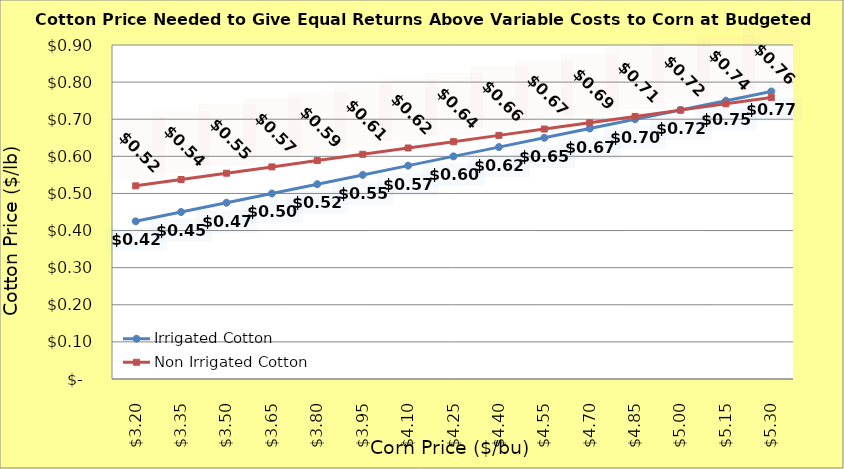
| Category | Irrigated Cotton | Non Irrigated Cotton |
|---|---|---|
| 3.2 | 0.425 | 0.521 |
| 3.35 | 0.45 | 0.538 |
| 3.5 | 0.475 | 0.555 |
| 3.65 | 0.5 | 0.572 |
| 3.8 | 0.525 | 0.589 |
| 3.9499999999999997 | 0.55 | 0.606 |
| 4.1 | 0.575 | 0.623 |
| 4.25 | 0.6 | 0.64 |
| 4.4 | 0.625 | 0.657 |
| 4.550000000000001 | 0.65 | 0.674 |
| 4.700000000000001 | 0.675 | 0.691 |
| 4.850000000000001 | 0.7 | 0.708 |
| 5.000000000000002 | 0.725 | 0.725 |
| 5.150000000000002 | 0.75 | 0.742 |
| 5.3000000000000025 | 0.775 | 0.759 |